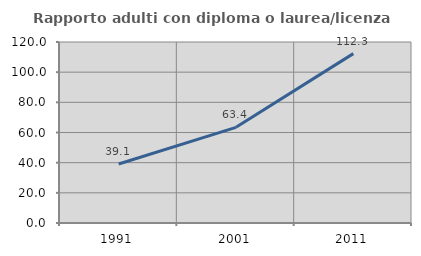
| Category | Rapporto adulti con diploma o laurea/licenza media  |
|---|---|
| 1991.0 | 39.127 |
| 2001.0 | 63.425 |
| 2011.0 | 112.295 |